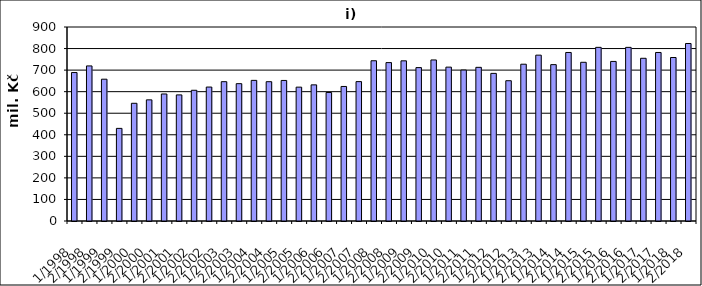
| Category | Series 0 |
|---|---|
| 1/1998 | 688760.017 |
| 2/1998 | 719496.928 |
| 1/1999 | 657840.827 |
| 2/1999 | 429661.173 |
| 1/2000 | 546087.943 |
| 2/2000 | 562028.057 |
| 1/2001 | 589251.452 |
| 2/2001 | 584991.289 |
| 1/2002 | 606497 |
| 2/2002 | 621398 |
| 1/2003 | 646316 |
| 2/2003 | 637148.132 |
| 1/2004 | 652400.03 |
| 2/2004 | 646292.268 |
| 1/2005 | 652030 |
| 2/2005 | 620936.919 |
| 1/2006 | 631555 |
| 2/2006 | 596217 |
| 1/2007 | 624186 |
| 2/2007 | 646645 |
| 1/2008 | 743418.13 |
| 2/2008 | 734809.87 |
| 1/2009 | 743053 |
| 2/2009 | 711641 |
| 1/2010 | 747131 |
| 2/2010 | 713784 |
| 1/2011 | 700318 |
| 2/2011 | 712877 |
| 1/2012 | 684822 |
| 2/2012 | 650844 |
| 1/2013 | 727398 |
| 2/2013 | 769389 |
| 1/2014 | 725395 |
| 2/2014 | 781835 |
| 1/2015 | 736272 |
| 2/2015 | 805599 |
| 1/2016 | 740296 |
| 2/2016 | 805540 |
| 1/2017 | 754869 |
| 2/2017 | 781815 |
| 1/2018 | 758456.263 |
| 2/2018 | 823516.788 |